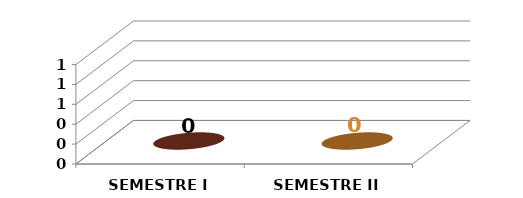
| Category | Series 0 |
|---|---|
| SEMESTRE I | 0 |
| SEMESTRE II | 0 |